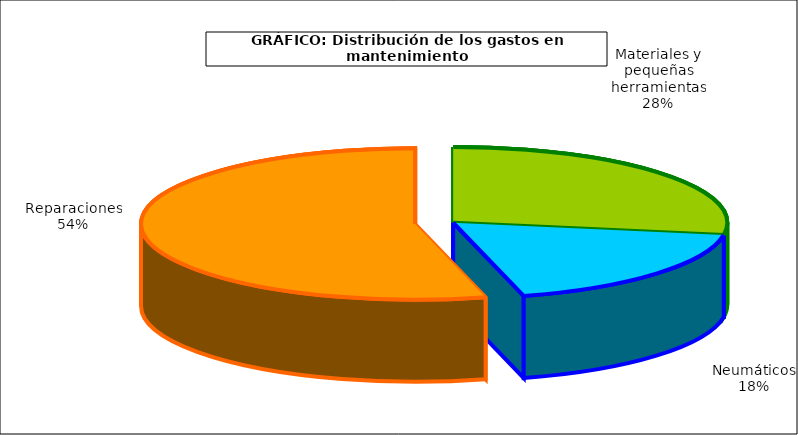
| Category | Series 0 |
|---|---|
| 0 | 448.823 |
| 1 | 298.066 |
| 2 | 881.708 |